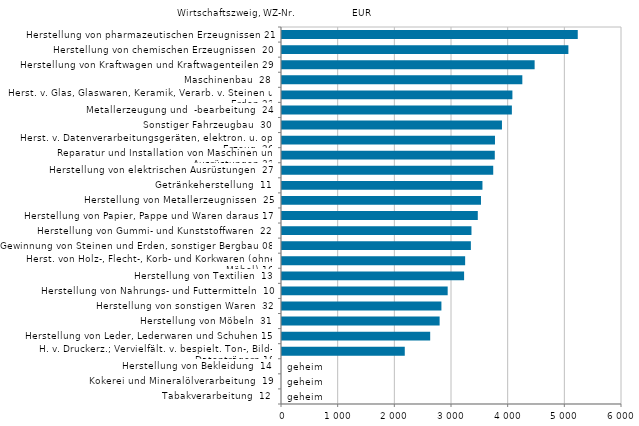
| Category | Series 0 |
|---|---|
| Herstellung von pharmazeutischen Erzeugnissen 21 | 5219.158 |
| Herstellung von chemischen Erzeugnissen  20 | 5053.748 |
| Herstellung von Kraftwagen und Kraftwagenteilen 29 | 4458.177 |
| Maschinenbau  28 | 4241.057 |
| Herst. v. Glas, Glaswaren, Keramik, Verarb. v. Steinen u. Erden 23 | 4066.002 |
| Metallerzeugung und  -bearbeitung  24 | 4056.502 |
| Sonstiger Fahrzeugbau  30 | 3881.394 |
| Herst. v. Datenverarbeitungsgeräten, elektron. u. opt. Erzeug. 26 | 3758.369 |
| Reparatur und Installation von Maschinen und Ausrüstungen 33 | 3755.06 |
| Herstellung von elektrischen Ausrüstungen  27 | 3727.586 |
| Getränkeherstellung  11 | 3537.339 |
| Herstellung von Metallerzeugnissen  25 | 3511.288 |
| Herstellung von Papier, Pappe und Waren daraus 17 | 3455.069 |
| Herstellung von Gummi- und Kunststoffwaren  22 | 3343.508 |
| Gewinnung von Steinen und Erden, sonstiger Bergbau 08 | 3332.945 |
| Herst. von Holz-, Flecht-, Korb- und Korkwaren (ohne Möbel) 16 | 3231.92 |
| Herstellung von Textilien  13 | 3213.497 |
| Herstellung von Nahrungs- und Futtermitteln  10 | 2923.667 |
| Herstellung von sonstigen Waren  32 | 2813.149 |
| Herstellung von Möbeln  31 | 2781.571 |
| Herstellung von Leder, Lederwaren und Schuhen 15 | 2615.07 |
| H. v. Druckerz.; Vervielfält. v. bespielt. Ton-, Bild-, Datenträgern 18 | 2166.453 |
| Herstellung von Bekleidung  14 | 0 |
| Kokerei und Mineralölverarbeitung  19 | 0 |
| Tabakverarbeitung  12 | 0 |